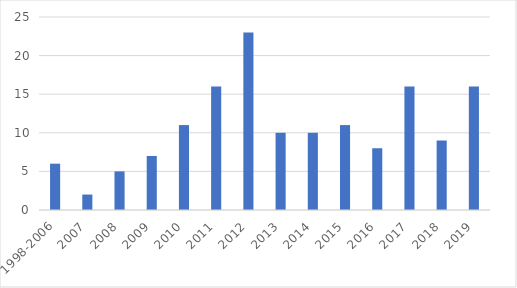
| Category | Series 0 |
|---|---|
| 1998-2006 | 6 |
| 2007 | 2 |
| 2008 | 5 |
| 2009 | 7 |
| 2010 | 11 |
| 2011 | 16 |
| 2012 | 23 |
| 2013 | 10 |
| 2014 | 10 |
| 2015 | 11 |
| 2016 | 8 |
| 2017 | 16 |
| 2018 | 9 |
| 2019 | 16 |